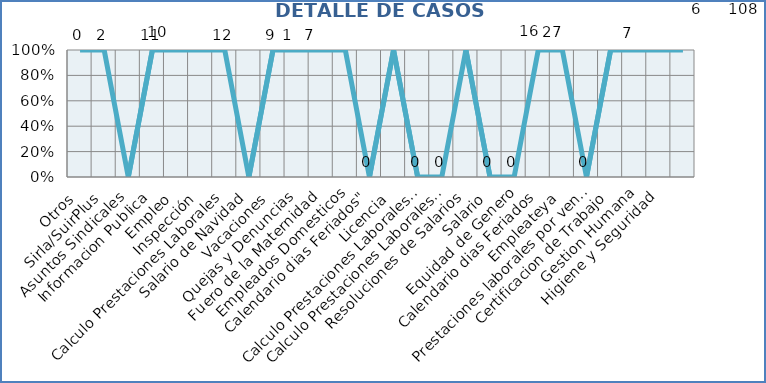
| Category | Series 0 |
|---|---|
| Otros | 11 |
| Sirla/SuirPlus | 5 |
| Asuntos Sindicales | 0 |
| Informacion Publica | 6 |
| Empleo | 3 |
| Inspección | 1 |
| Calculo Prestaciones Laborales | 24 |
| Salario de Navidad | 0 |
| Vacaciones | 4 |
| Quejas y Denuncias | 3 |
| Fuero de la Maternidad | 1 |
| Empleados Domesticos | 3 |
| Calendario dias Feriados" | 0 |
| Licencia | 4 |
| Calculo Prestaciones Laborales por quiebra empresa | 0 |
| Calculo Prestaciones Laborales por renuncia | 0 |
| Resoluciones de Salarios | 3 |
| Salario | 0 |
| Equidad de Genero | 0 |
| Calendario dias Feriados | 1 |
| Empleateya | 69 |
| Prestaciones laborales por venta empresa | 0 |
| Certificacion de Trabajo | 2 |
| Gestion Humana | 17 |
| Higiene y Seguridad | 2 |